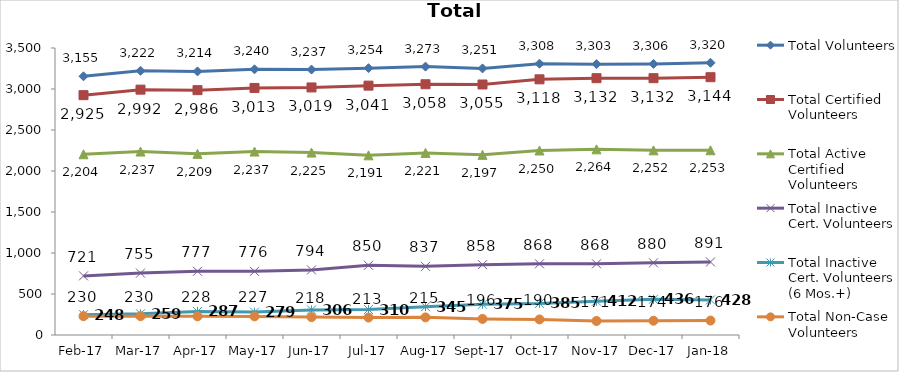
| Category | Total Volunteers | Total Certified Volunteers | Total Active Certified Volunteers | Total Inactive Cert. Volunteers | Total Inactive Cert. Volunteers (6 Mos.+) | Total Non-Case Volunteers |
|---|---|---|---|---|---|---|
| 2017-02-01 | 3155 | 2925 | 2204 | 721 | 248 | 230 |
| 2017-03-01 | 3222 | 2992 | 2237 | 755 | 259 | 230 |
| 2017-04-01 | 3214 | 2986 | 2209 | 777 | 287 | 228 |
| 2017-05-01 | 3240 | 3013 | 2237 | 776 | 279 | 227 |
| 2017-06-01 | 3237 | 3019 | 2225 | 794 | 306 | 218 |
| 2017-07-01 | 3254 | 3041 | 2191 | 850 | 310 | 213 |
| 2017-08-01 | 3273 | 3058 | 2221 | 837 | 345 | 215 |
| 2017-09-01 | 3251 | 3055 | 2197 | 858 | 375 | 196 |
| 2017-10-01 | 3308 | 3118 | 2250 | 868 | 385 | 190 |
| 2017-11-01 | 3303 | 3132 | 2264 | 868 | 412 | 171 |
| 2017-12-01 | 3306 | 3132 | 2252 | 880 | 436 | 174 |
| 2018-01-01 | 3320 | 3144 | 2253 | 891 | 428 | 176 |